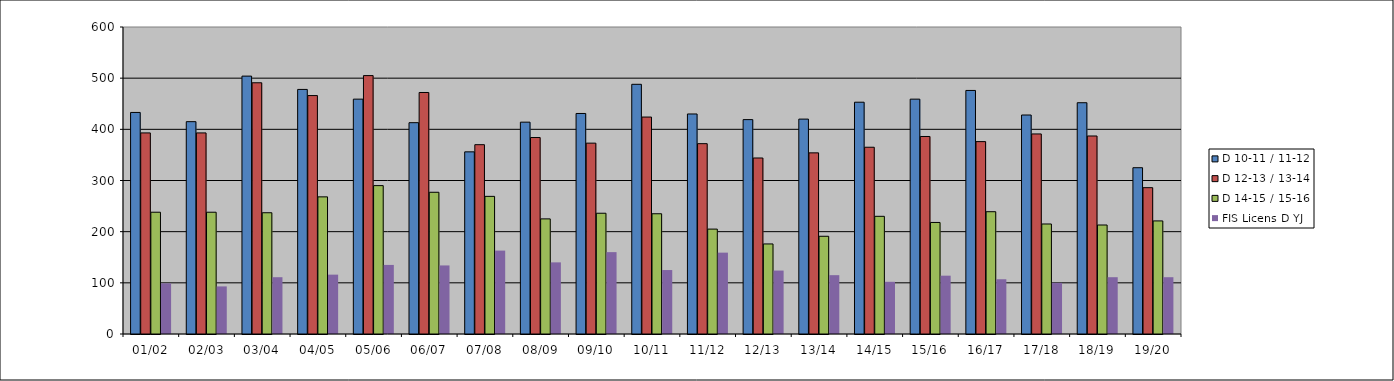
| Category | D 10-11 / 11-12 | D 12-13 / 13-14 | D 14-15 / 15-16 | FIS Licens D YJ |
|---|---|---|---|---|
| 01/02 | 433 | 393 | 238 | 99 |
| 02/03 | 415 | 393 | 238 | 93 |
| 03/04 | 504 | 491 | 237 | 111 |
| 04/05 | 478 | 466 | 268 | 116 |
| 05/06 | 459 | 505 | 290 | 135 |
| 06/07 | 413 | 472 | 277 | 134 |
| 07/08 | 356 | 370 | 269 | 163 |
| 08/09 | 414 | 384 | 225 | 140 |
| 09/10 | 431 | 373 | 236 | 160 |
| 10/11 | 488 | 424 | 235 | 125 |
| 11/12 | 430 | 372 | 205 | 159 |
| 12/13 | 419 | 344 | 176 | 124 |
| 13/14 | 420 | 354 | 191 | 115 |
| 14/15 | 453 | 365 | 230 | 102 |
| 15/16 | 459 | 386 | 218 | 114 |
| 16/17 | 476 | 376 | 239 | 107 |
| 17/18 | 428 | 391 | 215 | 100 |
| 18/19 | 452 | 387 | 213 | 111 |
| 19/20 | 325 | 286 | 221 | 111 |